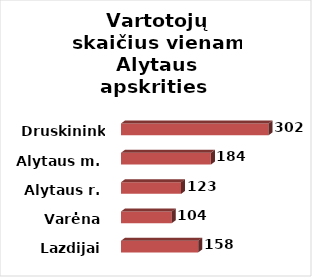
| Category | Series 0 |
|---|---|
| Lazdijai | 158 |
| Varėna | 104 |
| Alytaus r. | 123 |
| Alytaus m. | 184 |
| Druskininkai | 302 |